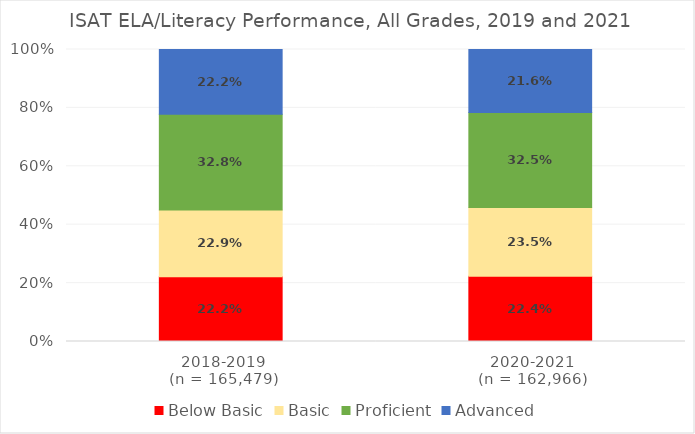
| Category | Below Basic | Basic | Proficient | Advanced |
|---|---|---|---|---|
| 2018-2019
(n = 165,479) | 0.222 | 0.229 | 0.328 | 0.222 |
| 2020-2021
(n = 162,966) | 0.224 | 0.235 | 0.325 | 0.216 |